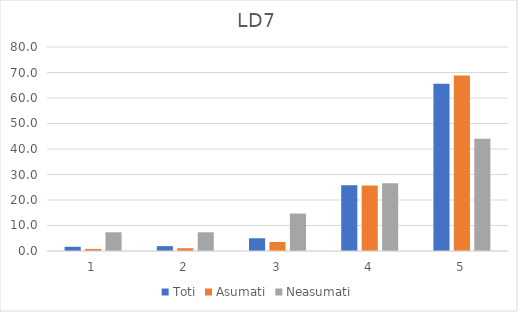
| Category | Toti | Asumati | Neasumati |
|---|---|---|---|
| 0 | 1.665 | 0.82 | 7.339 |
| 1 | 1.902 | 1.093 | 7.339 |
| 2 | 4.994 | 3.552 | 14.679 |
| 3 | 25.803 | 25.683 | 26.606 |
| 4 | 65.636 | 68.852 | 44.037 |